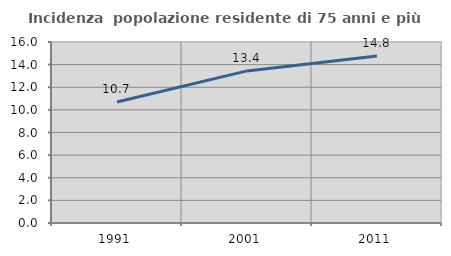
| Category | Incidenza  popolazione residente di 75 anni e più |
|---|---|
| 1991.0 | 10.699 |
| 2001.0 | 13.446 |
| 2011.0 | 14.759 |